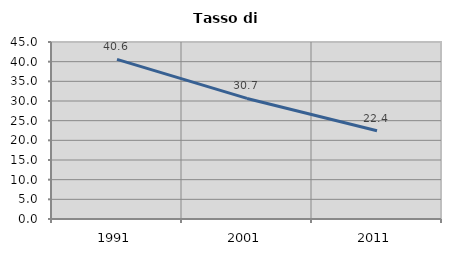
| Category | Tasso di disoccupazione   |
|---|---|
| 1991.0 | 40.596 |
| 2001.0 | 30.652 |
| 2011.0 | 22.427 |